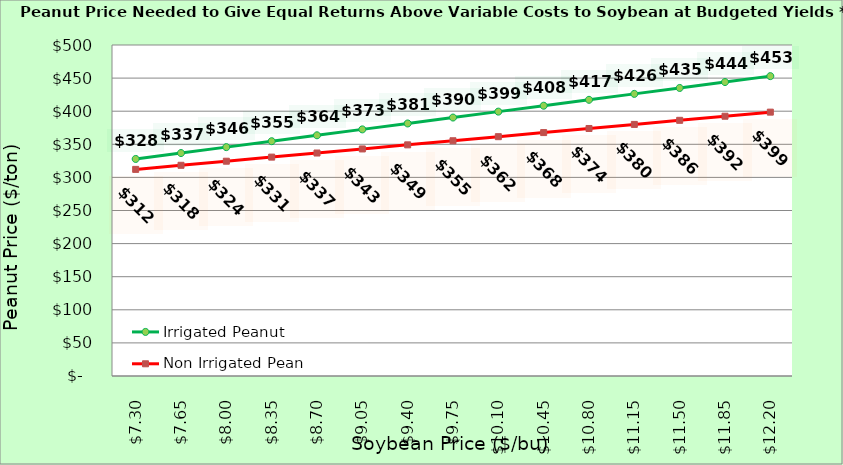
| Category | Irrigated Peanut | Non Irrigated Peanut |
|---|---|---|
| 7.3000000000000025 | 327.86 | 312.108 |
| 7.650000000000002 | 336.796 | 318.284 |
| 8.000000000000002 | 345.732 | 324.461 |
| 8.350000000000001 | 354.668 | 330.637 |
| 8.700000000000001 | 363.604 | 336.814 |
| 9.05 | 372.541 | 342.99 |
| 9.4 | 381.477 | 349.167 |
| 9.75 | 390.413 | 355.343 |
| 10.1 | 399.349 | 361.52 |
| 10.45 | 408.285 | 367.696 |
| 10.799999999999999 | 417.221 | 373.873 |
| 11.149999999999999 | 426.158 | 380.049 |
| 11.499999999999998 | 435.094 | 386.226 |
| 11.849999999999998 | 444.03 | 392.402 |
| 12.199999999999998 | 452.966 | 398.579 |